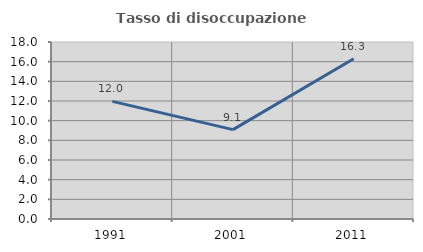
| Category | Tasso di disoccupazione giovanile  |
|---|---|
| 1991.0 | 11.962 |
| 2001.0 | 9.091 |
| 2011.0 | 16.304 |